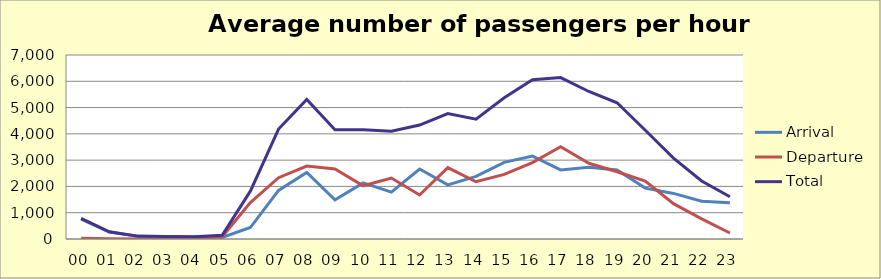
| Category | Arrival | Departure | Total |
|---|---|---|---|
| 00 | 752.553 | 31.386 | 783.94 |
| 01 | 266.523 | 9.584 | 276.107 |
| 02 | 105.584 | 3.995 | 109.578 |
| 03 | 91.849 | 1.699 | 93.548 |
| 04 | 78.915 | 6.595 | 85.51 |
| 05 | 57.334 | 84.559 | 141.893 |
| 06 | 436.23 | 1383.748 | 1819.978 |
| 07 | 1850.055 | 2332.373 | 4182.427 |
| 08 | 2530.784 | 2776.074 | 5306.858 |
| 09 | 1492.978 | 2660.058 | 4153.036 |
| 10 | 2135.096 | 2024.342 | 4159.438 |
| 11 | 1783.099 | 2320.414 | 4103.512 |
| 12 | 2660.49 | 1674.633 | 4335.123 |
| 13 | 2056.995 | 2716.953 | 4773.948 |
| 14 | 2380.485 | 2178.008 | 4558.493 |
| 15 | 2916.46 | 2457.8 | 5374.26 |
| 16 | 3152.477 | 2905.512 | 6057.989 |
| 17 | 2629.759 | 3509.803 | 6139.562 |
| 18 | 2730.126 | 2881.586 | 5611.712 |
| 19 | 2625.581 | 2558.079 | 5183.66 |
| 20 | 1935.277 | 2203.389 | 4138.666 |
| 21 | 1734.167 | 1343.468 | 3077.636 |
| 22 | 1438.57 | 768.419 | 2206.989 |
| 23 | 1376.184 | 229.57 | 1605.753 |